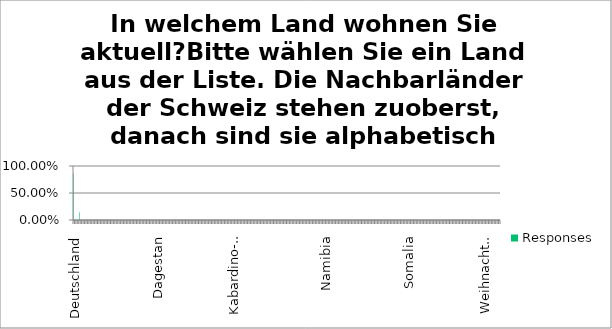
| Category | Responses |
|---|---|
| Deutschland | 0.857 |
| Frankreich | 0 |
| Italien | 0 |
| Lichtenstein | 0 |
| Österreich | 0.143 |
| Abchasien | 0 |
| Adscharien | 0 |
| Afghanistan | 0 |
| Ägypten | 0 |
| Alandinseln | 0 |
| Albanien | 0 |
| Alderney | 0 |
| Algerien | 0 |
| Amerikanisch-Samoa | 0 |
| Andorra | 0 |
| Angola | 0 |
| Anguilla | 0 |
| Antarktis | 0 |
| Antigua und Barbuda | 0 |
| Äquatorialguinea | 0 |
| Argentinien | 0 |
| Armenien | 0 |
| Aruba | 0 |
| Ascension | 0 |
| Aserbaidschan | 0 |
| Äthiopien | 0 |
| Australien | 0 |
| Azawad | 0 |
| Azoren | 0 |
| Bahamas | 0 |
| Bahrain | 0 |
| Bangladesch | 0 |
| Barbados | 0 |
| Belarus | 0 |
| Belgien | 0 |
| Belize | 0 |
| Benin | 0 |
| Bermuda | 0 |
| Bhutan | 0 |
| Biafra | 0 |
| Bolivien | 0 |
| Bonaire, Saint Eustatius und Saba | 0 |
| Bosnien und Herzegowina | 0 |
| Botsuana | 0 |
| Bouvetinsel | 0 |
| Brasilien | 0 |
| Britische Territorien im Indischen Ozean | 0 |
| Brunei Darussalam | 0 |
| Bulgarien | 0 |
| Burkina Faso | 0 |
| Burundi | 0 |
| Cabo Verde | 0 |
| Chile | 0 |
| China | 0 |
| Cookinseln | 0 |
| Costa Rica | 0 |
| Côte d'Ivoire | 0 |
| Curaçao | 0 |
| Dagestan | 0 |
| Dänemark | 0 |
| Deutsche Demokratische Republik | 0 |
| Deutschland | 0 |
| Dominica | 0 |
| Dominikanische Republik | 0 |
| Dschibuti | 0 |
| Ecuador | 0 |
| El Salvador | 0 |
| Eritrea | 0 |
| Estland | 0 |
| Eswatini | 0 |
| Falklandinseln | 0 |
| Färöer | 0 |
| Fidschi | 0 |
| Finnland | 0 |
| Französisch-Guayana | 0 |
| Französisch-Indochina | 0 |
| Französisch-Polynesien | 0 |
| Französische Süd- und Antarktisgebiete | 0 |
| Gabun | 0 |
| Gambia | 0 |
| Georgien | 0 |
| Ghana | 0 |
| Gibraltar | 0 |
| Grenada | 0 |
| Griechenland | 0 |
| Grönland | 0 |
| Guadeloupe | 0 |
| Guam | 0 |
| Guatemala | 0 |
| Guernsey | 0 |
| Guinea | 0 |
| Guinea-Bissau | 0 |
| Guyana | 0 |
| Haiti | 0 |
| Hawaii | 0 |
| Heard und McDonaldinseln | 0 |
| Honduras | 0 |
| Hongkong | 0 |
| Indien | 0 |
| Indonesien | 0 |
| Inguschetien | 0 |
| Insel Man | 0 |
| Irak | 0 |
| Iran | 0 |
| Irland | 0 |
| Island | 0 |
| Israel | 0 |
| Jamaika | 0 |
| Japan | 0 |
| Jemen | 0 |
| Jersey | 0 |
| Johnstoninsel | 0 |
| Jordanien | 0 |
| Jugoslawien | 0 |
| Jungferninseln (UK) | 0 |
| Jungferninseln (USA) | 0 |
| Kabardino-Balkarien | 0 |
| Kaimaninseln | 0 |
| Kambodscha | 0 |
| Kamerun | 0 |
| Kanada | 0 |
| Kanarische Inseln | 0 |
| Karatschai-Tscherkessien | 0 |
| Kasachstan | 0 |
| Katar | 0 |
| Kenia | 0 |
| Kirgisistan | 0 |
| Kiribati | 0 |
| Kleinere amerikanische Überseeinseln | 0 |
| Kokosinseln | 0 |
| Kolumbien | 0 |
| Komoren | 0 |
| Kongo (Brazzaville) | 0 |
| Kongo (Kinshasa) | 0 |
| Korea (Nord-) | 0 |
| Korea (Süd-) | 0 |
| Kosovo | 0 |
| Kroatien | 0 |
| Kuba | 0 |
| Kuwait | 0 |
| Laos | 0 |
| Lesotho | 0 |
| Lettland | 0 |
| Libanon | 0 |
| Liberia | 0 |
| Libyen | 0 |
| Liechtenstein | 0 |
| Litauen | 0 |
| Luxemburg | 0 |
| Macao | 0 |
| Madagaskar | 0 |
| Madeira | 0 |
| Malawi | 0 |
| Malaysia | 0 |
| Malediven | 0 |
| Mali | 0 |
| Malta | 0 |
| Marokko | 0 |
| Marshallinseln | 0 |
| Martinique | 0 |
| Mauretanien | 0 |
| Mauritius | 0 |
| Mayotte | 0 |
| Mazedonien | 0 |
| Mexiko | 0 |
| Midwayinseln | 0 |
| Mikronesien | 0 |
| Moldova | 0 |
| Monaco | 0 |
| Mongolei | 0 |
| Montenegro | 0 |
| Montserrat | 0 |
| Mosambik | 0 |
| Myanmar | 0 |
| Namibia | 0 |
| Nauru | 0 |
| Nepal | 0 |
| Neukaledonien | 0 |
| Neuseeland | 0 |
| Nicaragua | 0 |
| Niederlande | 0 |
| Niederländische Antillen | 0 |
| Niger | 0 |
| Nigeria | 0 |
| Niue | 0 |
| Nordjemen | 0 |
| Nördliche Marianen | 0 |
| Nordossetien-Alanien | 0 |
| Nordvietnam | 0 |
| Norfolkinsel | 0 |
| Norwegen | 0 |
| Oman | 0 |
| Pakistan | 0 |
| Palästina | 0 |
| Palau | 0 |
| Panama | 0 |
| Papua-Neuguinea | 0 |
| Paraguay | 0 |
| Peru | 0 |
| Philippinen | 0 |
| Pitcairninseln | 0 |
| Polen | 0 |
| Portugal | 0 |
| Provinz Wojwodina | 0 |
| Puerto Rico | 0 |
| Reunion | 0 |
| Ruanda | 0 |
| Rumänien | 0 |
| Russland | 0 |
| Saint-Barthélemy | 0 |
| Saint-Martin (Frankreich) | 0 |
| Salomoninseln | 0 |
| Sambia | 0 |
| Samoa | 0 |
| San Marino | 0 |
| Sansibar | 0 |
| São Tomé und Príncipe | 0 |
| Sarawak | 0 |
| Sark | 0 |
| Saudi-Arabien | 0 |
| Schweden | 0 |
| Senegal | 0 |
| Serbien | 0 |
| Serbien und Montenegro | 0 |
| Seychellen | 0 |
| Sierra Leone | 0 |
| Sikkim | 0 |
| Simbabwe | 0 |
| Singapur | 0 |
| Sint Maarten (Niederlande) | 0 |
| Slowakei | 0 |
| Slowenien | 0 |
| Somalia | 0 |
| Spanien | 0 |
| Spanisch-Nordafrika | 0 |
| Sri Lanka | 0 |
| St. Helena | 0 |
| St. Kitts und Nevis | 0 |
| St. Lucia | 0 |
| St. Pierre und Miquelon | 0 |
| St. Vincent und die Grenadinen | 0 |
| Südafrika | 0 |
| Sudan | 0 |
| Südgeorgien und Südliche Sandwichinseln | 0 |
| Südjemen | 0 |
| Südossetien | 0 |
| Südsudan | 0 |
| Südvietnam | 0 |
| Suriname | 0 |
| Svalbard und Jan Mayen | 0 |
| Syrien | 0 |
| Tadschikistan | 0 |
| Taiwan (Chinesisches Taipei) | 0 |
| Tanganjika | 0 |
| Tansania | 0 |
| Thailand | 0 |
| Tibet | 0 |
| Timor (Portugal) | 0 |
| Timor-Leste | 0 |
| Togo | 0 |
| Tokelau | 0 |
| Tonga | 0 |
| Triest | 0 |
| Trinidad und Tobago | 0 |
| Tristan da Cunha | 0 |
| Tschad | 0 |
| Tschechien | 0 |
| Tschechoslowakei | 0 |
| Tschetschenien | 0 |
| Tunesien | 0 |
| Türkei | 0 |
| Turkmenistan | 0 |
| Turks- und Caicosinseln | 0 |
| Tuvalu | 0 |
| Uganda | 0 |
| Ukraine | 0 |
| Ungarn | 0 |
| Union der Sozialistischen Sowjetrepubliken | 0 |
| Uruguay | 0 |
| Usbekistan | 0 |
| Vanuatu | 0 |
| Vatikanstadt | 0 |
| Venezuela | 0 |
| Vereinigte Arabische Emirate | 0 |
| Vereinigte Arabische Republik | 0 |
| Vereinigte Staaten | 0 |
| Vereinigtes Königreich | 0 |
| Vietnam | 0 |
| Wakeinsel | 0 |
| Wallis und Futuna | 0 |
| Weihnachtsinsel | 0 |
| Westberlin | 0 |
| Westsahara | 0 |
| Zentralafrikanische Republik | 0 |
| Zentralserbien | 0 |
| Zypern | 0 |